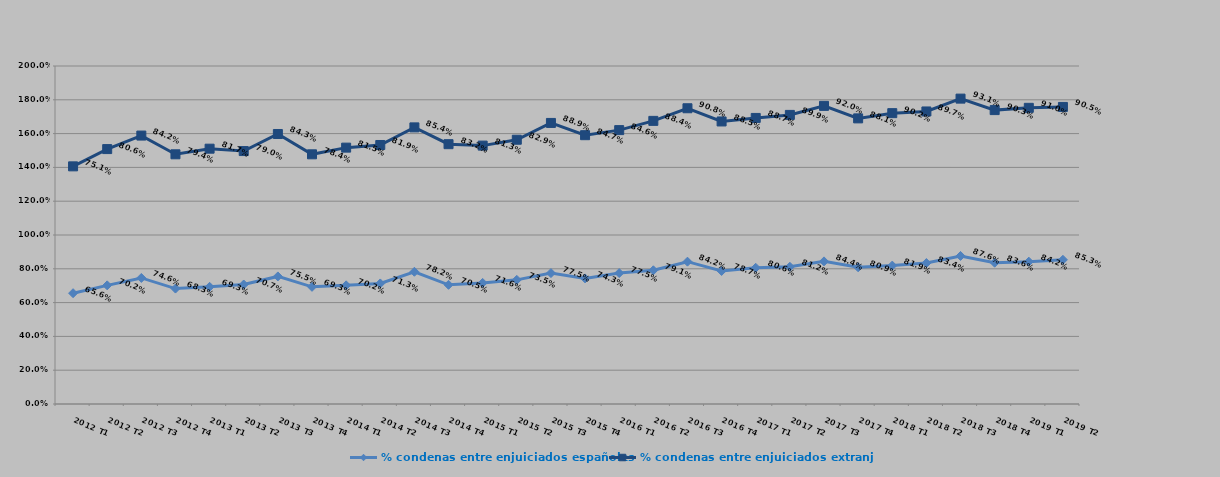
| Category | % condenas entre enjuiciados españoles | % condenas entre enjuiciados extranjeros |
|---|---|---|
| 2012 T1 | 0.656 | 0.751 |
| 2012 T2 | 0.702 | 0.806 |
| 2012 T3 | 0.746 | 0.842 |
| 2012 T4 | 0.683 | 0.794 |
| 2013 T1 | 0.693 | 0.817 |
| 2013 T2 | 0.707 | 0.79 |
| 2013 T3 | 0.755 | 0.843 |
| 2013 T4 | 0.693 | 0.784 |
| 2014 T1 | 0.702 | 0.815 |
| 2014 T2 | 0.713 | 0.819 |
| 2014 T3 | 0.782 | 0.854 |
| 2014 T4 | 0.705 | 0.832 |
| 2015 T1 | 0.716 | 0.812 |
| 2015 T2 | 0.735 | 0.829 |
| 2015 T3 | 0.775 | 0.889 |
| 2015 T4 | 0.743 | 0.847 |
| 2016 T1 | 0.775 | 0.846 |
| 2016 T2 | 0.791 | 0.884 |
| 2016 T3 | 0.842 | 0.908 |
| 2016 T4 | 0.787 | 0.885 |
| 2017 T1 | 0.806 | 0.887 |
| 2017 T2 | 0.812 | 0.899 |
| 2017 T3 | 0.844 | 0.92 |
| 2017 T4 | 0.809 | 0.881 |
| 2018 T1 | 0.819 | 0.902 |
| 2018 T2 | 0.834 | 0.897 |
| 2018 T3 | 0.876 | 0.931 |
| 2018 T4 | 0.836 | 0.903 |
| 2019 T1 | 0.842 | 0.91 |
| 2019 T2 | 0.853 | 0.905 |